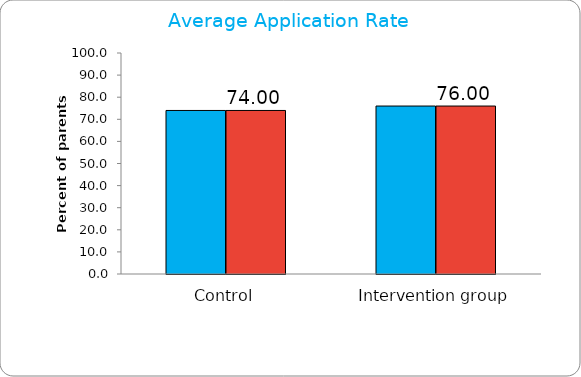
| Category | Series 0 | Series 1 |
|---|---|---|
| Control | 74 | 74 |
| Intervention group | 76 | 76 |